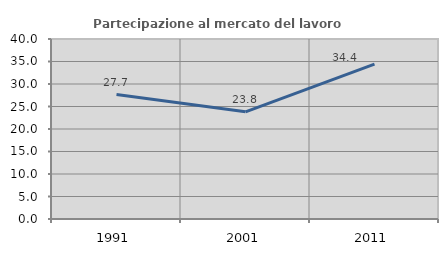
| Category | Partecipazione al mercato del lavoro  femminile |
|---|---|
| 1991.0 | 27.66 |
| 2001.0 | 23.81 |
| 2011.0 | 34.435 |